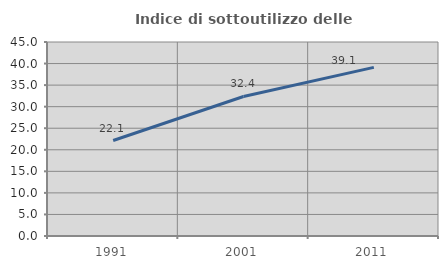
| Category | Indice di sottoutilizzo delle abitazioni  |
|---|---|
| 1991.0 | 22.149 |
| 2001.0 | 32.366 |
| 2011.0 | 39.115 |